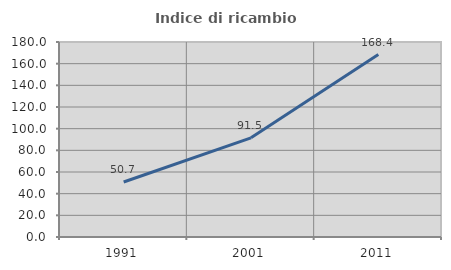
| Category | Indice di ricambio occupazionale  |
|---|---|
| 1991.0 | 50.735 |
| 2001.0 | 91.509 |
| 2011.0 | 168.449 |